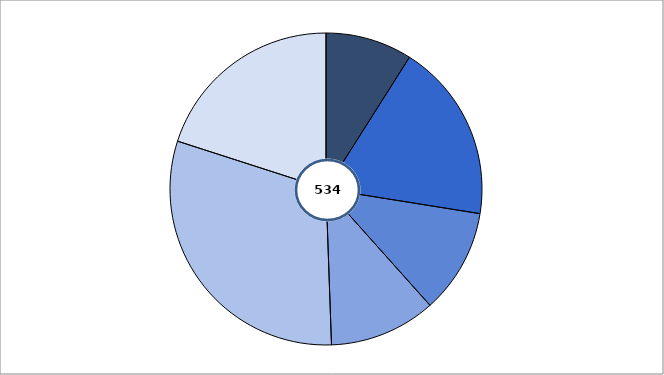
| Category | Series 1 |
|---|---|
| 0 | 48 |
| 1 | 99 |
| 2 | 58 |
| 3 | 59 |
| 4 | 163 |
| 5 | 107 |